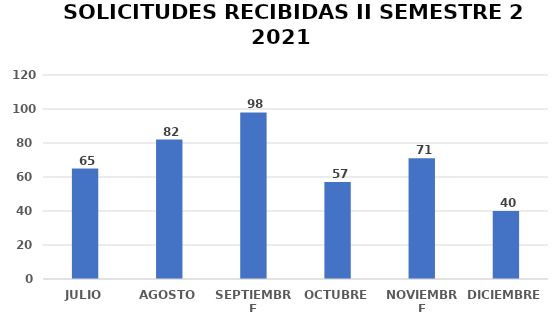
| Category | Series 0 |
|---|---|
| JULIO | 65 |
| AGOSTO | 82 |
| SEPTIEMBRE | 98 |
| OCTUBRE | 57 |
| NOVIEMBRE | 71 |
| DICIEMBRE | 40 |